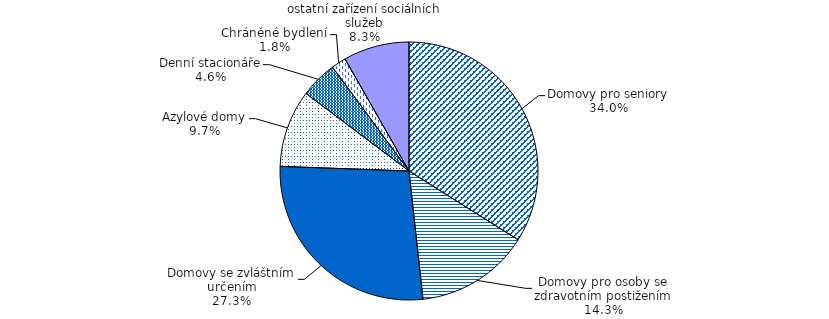
| Category | Series 0 |
|---|---|
| Domovy pro seniory | 3072 |
| Domovy pro osoby se zdravotním postižením | 1295 |
| Domovy se zvláštním určením | 2470 |
| Azylové domy | 877 |
| Denní stacionáře | 419 |
| Chráněné bydlení | 167 |
| ostatní zařízení sociálních služeb | 747 |